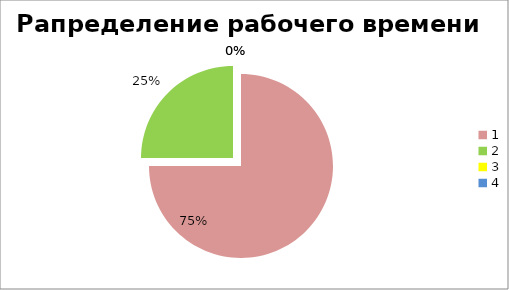
| Category | Series 0 |
|---|---|
| 0 | 0.312 |
| 1 | 0.104 |
| 2 | 0 |
| 3 | 0 |